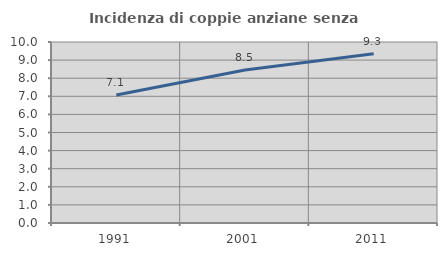
| Category | Incidenza di coppie anziane senza figli  |
|---|---|
| 1991.0 | 7.074 |
| 2001.0 | 8.453 |
| 2011.0 | 9.347 |